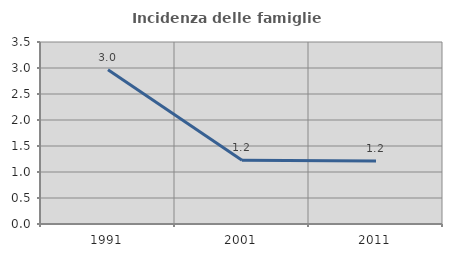
| Category | Incidenza delle famiglie numerose |
|---|---|
| 1991.0 | 2.968 |
| 2001.0 | 1.225 |
| 2011.0 | 1.213 |